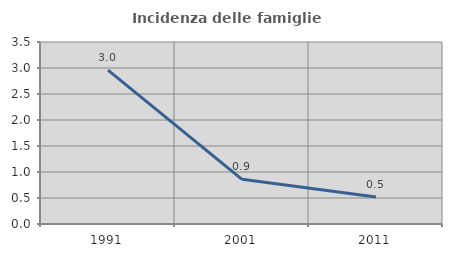
| Category | Incidenza delle famiglie numerose |
|---|---|
| 1991.0 | 2.961 |
| 2001.0 | 0.86 |
| 2011.0 | 0.519 |